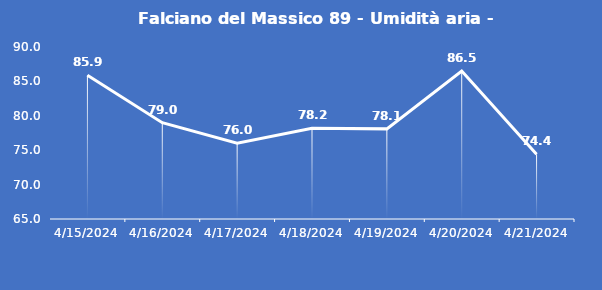
| Category | Falciano del Massico 89 - Umidità aria - Grezzo (%) |
|---|---|
| 4/15/24 | 85.9 |
| 4/16/24 | 79 |
| 4/17/24 | 76 |
| 4/18/24 | 78.2 |
| 4/19/24 | 78.1 |
| 4/20/24 | 86.5 |
| 4/21/24 | 74.4 |